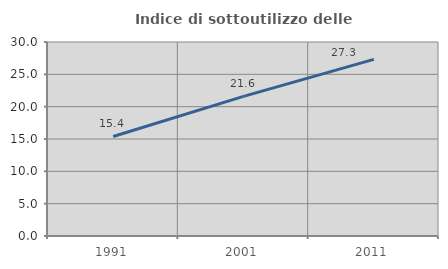
| Category | Indice di sottoutilizzo delle abitazioni  |
|---|---|
| 1991.0 | 15.391 |
| 2001.0 | 21.587 |
| 2011.0 | 27.309 |